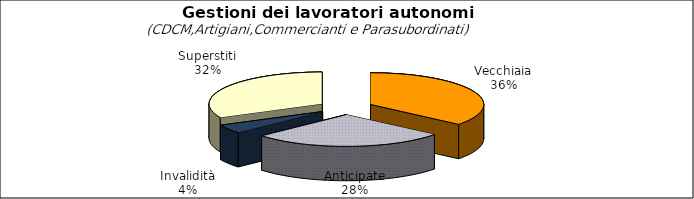
| Category | Series 0 |
|---|---|
| Vecchiaia | 85893 |
| Anticipate | 66214 |
| Invalidità | 10718 |
| Superstiti | 77027 |